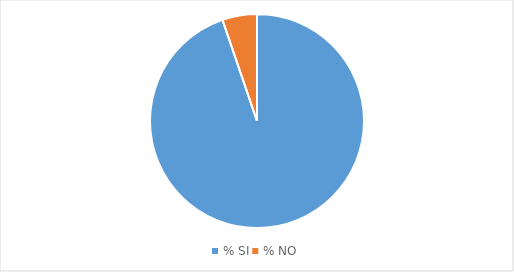
| Category | Series 0 | Series 1 | Series 2 | Series 3 | Series 4 | Series 5 | Series 6 | Series 7 | Series 8 | Series 9 |
|---|---|---|---|---|---|---|---|---|---|---|
| % SI | 8.53 | 5.687 | 5.69 | 9.004 | 10.9 | 9.952 | 10.426 | 17.061 | 9.004 | 9.478 |
| % NO | 0.472 | 1.415 | 0 | 0 | 0.943 | 0.472 | 0 | 0 | 0.472 | 0.472 |